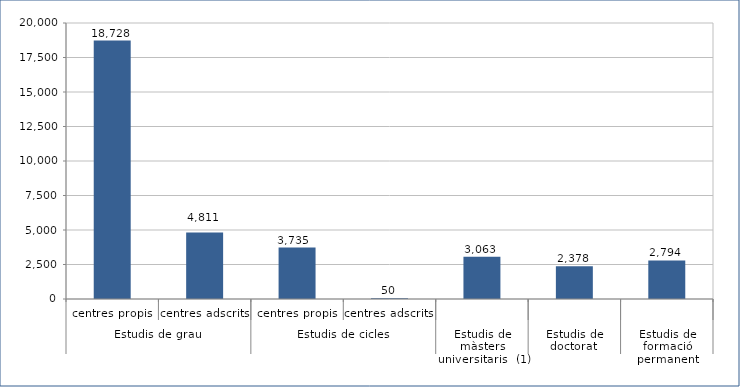
| Category | Series 0 |
|---|---|
| 0 | 18728 |
| 1 | 4811 |
| 2 | 3735 |
| 3 | 50 |
| 4 | 3063 |
| 5 | 2378 |
| 6 | 2794 |